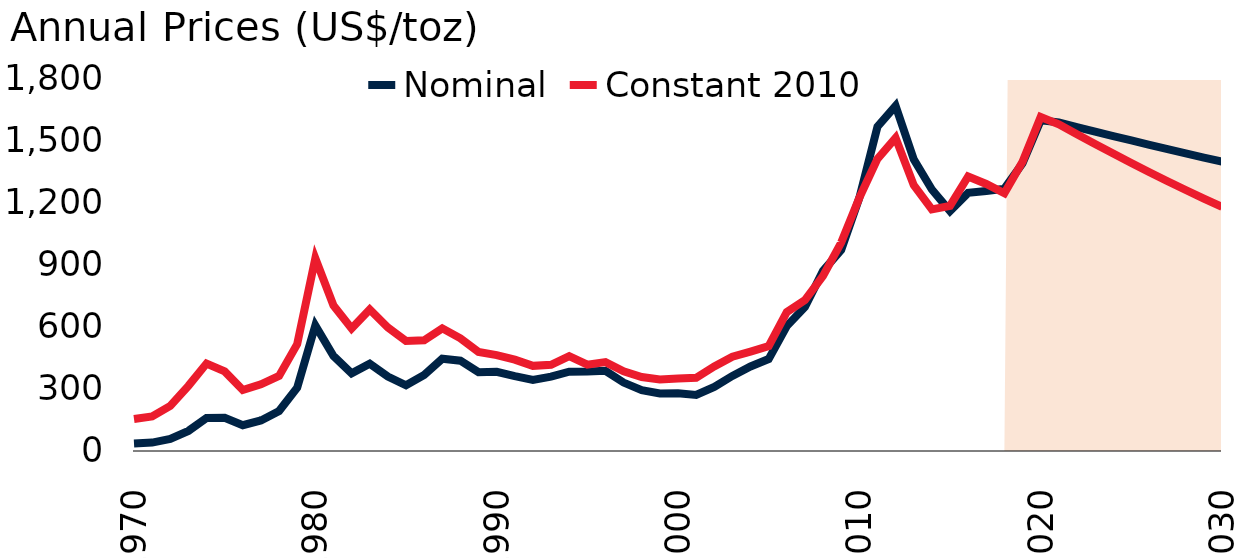
| Category | Nominal | Constant 2010 |
|---|---|---|
| 1970.0 | 35.942 | 154.823 |
| 1971.0 | 40.804 | 167.13 |
| 1972.0 | 58.159 | 218.375 |
| 1973.0 | 97.326 | 315.107 |
| 1974.0 | 159.245 | 423.075 |
| 1975.0 | 161.029 | 385.211 |
| 1976.0 | 124.816 | 294.962 |
| 1977.0 | 147.721 | 322.941 |
| 1978.0 | 193.239 | 363.52 |
| 1979.0 | 306.668 | 517.158 |
| 1980.0 | 607.864 | 931.959 |
| 1981.0 | 459.754 | 704.077 |
| 1982.0 | 375.797 | 593.17 |
| 1983.0 | 422.53 | 685.104 |
| 1984.0 | 360.478 | 597.642 |
| 1985.0 | 317.908 | 532.619 |
| 1986.0 | 367.694 | 535.602 |
| 1987.0 | 446.472 | 593.475 |
| 1988.0 | 437.048 | 545.539 |
| 1989.0 | 381.432 | 478.986 |
| 1990.0 | 383.467 | 463.839 |
| 1991.0 | 362.182 | 442.16 |
| 1992.0 | 343.733 | 411.937 |
| 1993.0 | 359.77 | 416.774 |
| 1994.0 | 384.012 | 458.631 |
| 1995.0 | 384.164 | 417.933 |
| 1996.0 | 387.696 | 429.968 |
| 1997.0 | 331.096 | 385.344 |
| 1998.0 | 294.161 | 357.986 |
| 1999.0 | 278.768 | 345.903 |
| 2000.0 | 279.032 | 350.72 |
| 2001.0 | 270.989 | 353.879 |
| 2002.0 | 309.972 | 409.567 |
| 2003.0 | 363.509 | 456.567 |
| 2004.0 | 409.212 | 481.278 |
| 2005.0 | 444.843 | 507.207 |
| 2006.0 | 604.336 | 672.036 |
| 2007.0 | 696.72 | 730.087 |
| 2008.0 | 871.707 | 847.685 |
| 2009.0 | 972.966 | 1008.651 |
| 2010.0 | 1224.664 | 1224.664 |
| 2011.0 | 1569.211 | 1413.758 |
| 2012.0 | 1669.518 | 1515.33 |
| 2013.0 | 1411.462 | 1286.721 |
| 2014.0 | 1265.578 | 1169.476 |
| 2015.0 | 1160.663 | 1186.069 |
| 2016.0 | 1248.988 | 1328.235 |
| 2017.0 | 1257.559 | 1292.172 |
| 2018.0 | 1269.227 | 1247.033 |
| 2019.0 | 1392.498 | 1399.805 |
| 2020.0 | 1600 | 1616.333 |
| 2021.0 | 1590 | 1580.976 |
| 2022.0 | 1567.675 | 1533.088 |
| 2023.0 | 1545.664 | 1485.784 |
| 2024.0 | 1523.962 | 1439.26 |
| 2025.0 | 1502.564 | 1393.637 |
| 2026.0 | 1481.467 | 1348.99 |
| 2027.0 | 1460.666 | 1305.367 |
| 2028.0 | 1440.158 | 1262.794 |
| 2029.0 | 1419.937 | 1221.284 |
| 2030.0 | 1400 | 1180.84 |